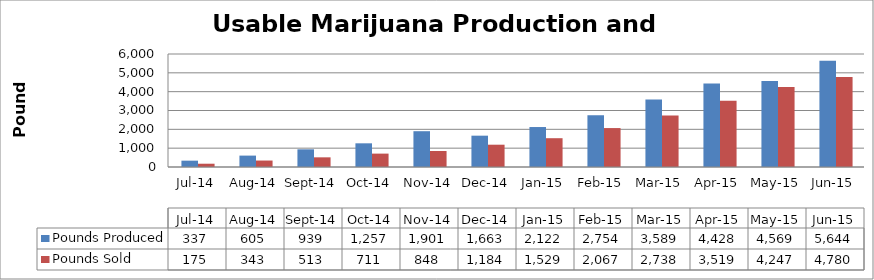
| Category | Pounds Produced | Pounds Sold |
|---|---|---|
| 2014-07-01 | 336.846 | 174.516 |
| 2014-08-01 | 605.226 | 343.09 |
| 2014-09-01 | 938.859 | 513.095 |
| 2014-10-01 | 1257.476 | 710.763 |
| 2014-11-01 | 1900.863 | 848.408 |
| 2014-12-01 | 1663.356 | 1183.908 |
| 2015-01-01 | 2122.244 | 1529.022 |
| 2015-02-01 | 2754.272 | 2066.987 |
| 2015-03-01 | 3589.173 | 2737.635 |
| 2015-04-01 | 4428.236 | 3518.603 |
| 2015-05-01 | 4569.39 | 4246.556 |
| 2015-06-01 | 5644.254 | 4780.429 |